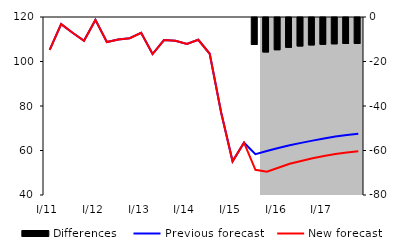
| Category | Differences |
|---|---|
| 0 | 0 |
| 1 | 0 |
| 2 | 0 |
| 3 | 0 |
| 4 | 0 |
| 5 | 0 |
| 6 | 0 |
| 7 | 0 |
| 8 | 0 |
| 9 | 0 |
| 10 | 0 |
| 11 | 0 |
| 12 | 0 |
| 13 | 0 |
| 14 | 0 |
| 15 | 0 |
| 16 | 0 |
| 17 | 0 |
| 18 | -12.112 |
| 19 | -15.487 |
| 20 | -14.481 |
| 21 | -13.39 |
| 22 | -12.798 |
| 23 | -12.321 |
| 24 | -12.039 |
| 25 | -11.815 |
| 26 | -11.69 |
| 27 | -11.685 |